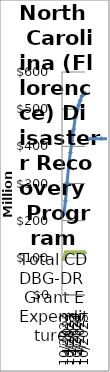
| Category | Projected Expenditures | Actual Expenditure |
|---|---|---|
| 10/2022 | 217188151.04 | 97038031.57 |
| 1/2023 | 253477819.72 | 115470991.82 |
| 4/2023 | 302481427.28 | 115470991.82 |
| 7/2023 | 351534989.6 | 115470991.82 |
| 10/2023 | 383142519.92 | 115470991.82 |
| 1/2024 | 414750050.24 | 115470991.82 |
| 4/2024 | 446457580.56 | 115470991.82 |
| 7/2024 | 478165110.88 | 115470991.82 |
| 10/2024 | 494949931.2 | 115470991.82 |
| 1/2025 | 510548131.52 | 115470991.82 |
| 4/2025 | 523359551.84 | 115470991.82 |
| 7/2025 | 535244532.16 | 115470991.82 |
| 10/2025 | 538989852.48 | 115470991.82 |
| 1/2026 | 542643999.8 | 115470991.82 |